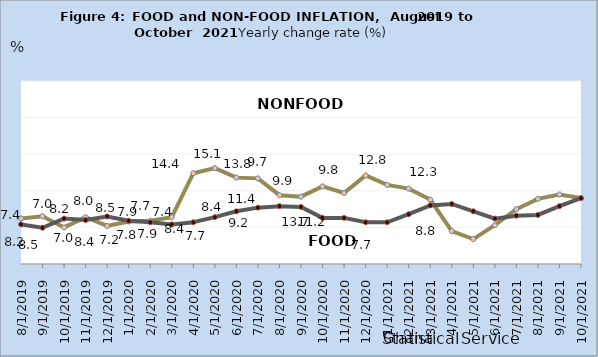
| Category | Series 0 | Series 1 |
|---|---|---|
| Aug-19 | 8.228 | 7.412 |
| Sep-19 | 8.531 | 6.95 |
| Oct-19 | 7 | 8.2 |
| Nov-19 | 8.4 | 8 |
| Dec-19 | 7.2 | 8.5 |
| Jan-20 | 7.8 | 7.9 |
| Feb-20 | 7.9 | 7.7 |
| Mar-20 | 8.4 | 7.4 |
| Apr-20 | 14.4 | 7.7 |
| May-20 | 15.1 | 8.4 |
| Jun-20 | 13.8 | 9.2 |
| Jul-20 | 13.7 | 9.7 |
| Aug-20 | 11.4 | 9.9 |
| Sep-20 | 11.2 | 9.8 |
| Oct-20 | 12.6 | 8.3 |
| Nov-20 | 11.7 | 8.3 |
| Dec-20 | 14.1 | 7.7 |
| Jan-21 | 12.8 | 7.7 |
| Feb-21 | 12.3 | 8.8 |
| Mar-21 | 10.8 | 10 |
| Apr-21 | 6.5 | 10.2 |
| May-21 | 5.4 | 9.2 |
| Jun-21 | 7.3 | 8.2 |
| Jul-21 | 9.5 | 8.6 |
| Aug-21 | 10.9 | 8.7 |
| Sep-21 | 11.5 | 9.9 |
| Oct-21 | 11 | 11 |